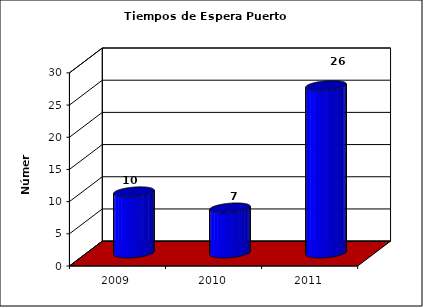
| Category | Series 0 |
|---|---|
| 2009.0 | 9.5 |
| 2010.0 | 7 |
| 2011.0 | 26 |